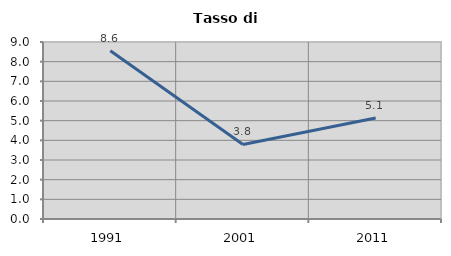
| Category | Tasso di disoccupazione   |
|---|---|
| 1991.0 | 8.558 |
| 2001.0 | 3.789 |
| 2011.0 | 5.138 |